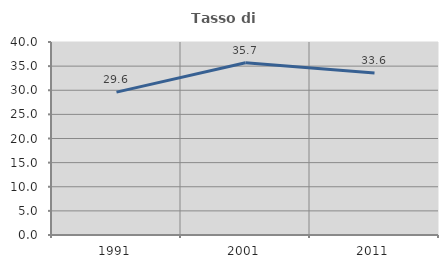
| Category | Tasso di occupazione   |
|---|---|
| 1991.0 | 29.615 |
| 2001.0 | 35.697 |
| 2011.0 | 33.6 |